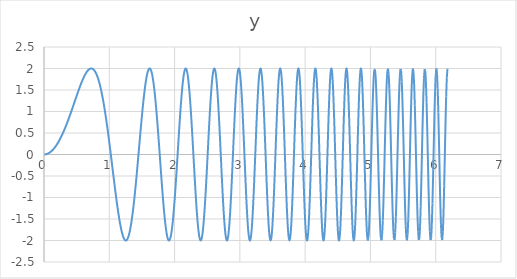
| Category | y |
|---|---|
| 0.0 | 0 |
| 0.01 | 0.001 |
| 0.02 | 0.002 |
| 0.03 | 0.005 |
| 0.04 | 0.01 |
| 0.05 | 0.015 |
| 0.06 | 0.022 |
| 0.07 | 0.029 |
| 0.08 | 0.038 |
| 0.09 | 0.049 |
| 0.1 | 0.06 |
| 0.11 | 0.073 |
| 0.12 | 0.086 |
| 0.13 | 0.101 |
| 0.14 | 0.118 |
| 0.15 | 0.135 |
| 0.16 | 0.153 |
| 0.17 | 0.173 |
| 0.18 | 0.194 |
| 0.19 | 0.216 |
| 0.2 | 0.239 |
| 0.21 | 0.264 |
| 0.22 | 0.289 |
| 0.23 | 0.316 |
| 0.24 | 0.344 |
| 0.25 | 0.373 |
| 0.26 | 0.403 |
| 0.27 | 0.434 |
| 0.28 | 0.466 |
| 0.29 | 0.499 |
| 0.3 | 0.533 |
| 0.31 | 0.569 |
| 0.32 | 0.605 |
| 0.33 | 0.642 |
| 0.34 | 0.68 |
| 0.35000000000000003 | 0.719 |
| 0.36 | 0.758 |
| 0.37 | 0.799 |
| 0.38 | 0.84 |
| 0.39 | 0.881 |
| 0.4 | 0.924 |
| 0.41000000000000003 | 0.966 |
| 0.42 | 1.01 |
| 0.43 | 1.053 |
| 0.44 | 1.097 |
| 0.45 | 1.142 |
| 0.46 | 1.186 |
| 0.47000000000000003 | 1.23 |
| 0.48 | 1.275 |
| 0.49 | 1.319 |
| 0.5 | 1.363 |
| 0.51 | 1.407 |
| 0.52 | 1.45 |
| 0.53 | 1.493 |
| 0.54 | 1.535 |
| 0.55 | 1.576 |
| 0.56 | 1.616 |
| 0.5700000000000001 | 1.655 |
| 0.58 | 1.693 |
| 0.59 | 1.729 |
| 0.6 | 1.764 |
| 0.61 | 1.797 |
| 0.62 | 1.828 |
| 0.63 | 1.857 |
| 0.64 | 1.884 |
| 0.65 | 1.909 |
| 0.66 | 1.931 |
| 0.67 | 1.95 |
| 0.68 | 1.966 |
| 0.6900000000000001 | 1.98 |
| 0.7000000000000001 | 1.99 |
| 0.71 | 1.997 |
| 0.72 | 2 |
| 0.73 | 1.999 |
| 0.74 | 1.995 |
| 0.75 | 1.986 |
| 0.76 | 1.974 |
| 0.77 | 1.957 |
| 0.78 | 1.936 |
| 0.79 | 1.91 |
| 0.8 | 1.879 |
| 0.81 | 1.844 |
| 0.8200000000000001 | 1.804 |
| 0.8300000000000001 | 1.759 |
| 0.84 | 1.709 |
| 0.85 | 1.654 |
| 0.86 | 1.595 |
| 0.87 | 1.53 |
| 0.88 | 1.46 |
| 0.89 | 1.385 |
| 0.9 | 1.306 |
| 0.91 | 1.222 |
| 0.92 | 1.133 |
| 0.93 | 1.04 |
| 0.9400000000000001 | 0.943 |
| 0.9500000000000001 | 0.841 |
| 0.96 | 0.736 |
| 0.97 | 0.627 |
| 0.98 | 0.515 |
| 0.99 | 0.4 |
| 1.0 | 0.282 |
| 1.01 | 0.162 |
| 1.02 | 0.041 |
| 1.03 | -0.082 |
| 1.04 | -0.206 |
| 1.05 | -0.33 |
| 1.06 | -0.454 |
| 1.07 | -0.578 |
| 1.08 | -0.7 |
| 1.09 | -0.82 |
| 1.1 | -0.938 |
| 1.11 | -1.053 |
| 1.12 | -1.165 |
| 1.1300000000000001 | -1.272 |
| 1.1400000000000001 | -1.374 |
| 1.1500000000000001 | -1.47 |
| 1.16 | -1.561 |
| 1.17 | -1.644 |
| 1.18 | -1.72 |
| 1.19 | -1.788 |
| 1.2 | -1.848 |
| 1.21 | -1.898 |
| 1.22 | -1.939 |
| 1.23 | -1.97 |
| 1.24 | -1.99 |
| 1.25 | -1.999 |
| 1.26 | -1.997 |
| 1.27 | -1.984 |
| 1.28 | -1.959 |
| 1.29 | -1.922 |
| 1.3 | -1.873 |
| 1.31 | -1.813 |
| 1.32 | -1.741 |
| 1.33 | -1.657 |
| 1.34 | -1.562 |
| 1.35 | -1.456 |
| 1.36 | -1.34 |
| 1.37 | -1.214 |
| 1.3800000000000001 | -1.079 |
| 1.3900000000000001 | -0.936 |
| 1.4000000000000001 | -0.785 |
| 1.41 | -0.627 |
| 1.42 | -0.464 |
| 1.43 | -0.296 |
| 1.44 | -0.125 |
| 1.45 | 0.049 |
| 1.46 | 0.223 |
| 1.47 | 0.396 |
| 1.48 | 0.568 |
| 1.49 | 0.736 |
| 1.5 | 0.9 |
| 1.51 | 1.057 |
| 1.52 | 1.207 |
| 1.53 | 1.348 |
| 1.54 | 1.478 |
| 1.55 | 1.596 |
| 1.56 | 1.702 |
| 1.57 | 1.793 |
| 1.58 | 1.868 |
| 1.59 | 1.928 |
| 1.6 | 1.97 |
| 1.61 | 1.994 |
| 1.62 | 2 |
| 1.6300000000000001 | 1.986 |
| 1.6400000000000001 | 1.954 |
| 1.6500000000000001 | 1.903 |
| 1.6600000000000001 | 1.832 |
| 1.67 | 1.743 |
| 1.68 | 1.636 |
| 1.69 | 1.511 |
| 1.7 | 1.37 |
| 1.71 | 1.214 |
| 1.72 | 1.045 |
| 1.73 | 0.863 |
| 1.74 | 0.671 |
| 1.75 | 0.47 |
| 1.76 | 0.263 |
| 1.77 | 0.052 |
| 1.78 | -0.161 |
| 1.79 | -0.373 |
| 1.8 | -0.582 |
| 1.81 | -0.785 |
| 1.82 | -0.981 |
| 1.83 | -1.165 |
| 1.84 | -1.337 |
| 1.85 | -1.493 |
| 1.86 | -1.631 |
| 1.87 | -1.75 |
| 1.8800000000000001 | -1.848 |
| 1.8900000000000001 | -1.923 |
| 1.9000000000000001 | -1.973 |
| 1.9100000000000001 | -1.997 |
| 1.92 | -1.996 |
| 1.93 | -1.968 |
| 1.94 | -1.913 |
| 1.95 | -1.833 |
| 1.96 | -1.726 |
| 1.97 | -1.596 |
| 1.98 | -1.442 |
| 1.99 | -1.267 |
| 2.0 | -1.073 |
| 2.0100000000000002 | -0.863 |
| 2.02 | -0.639 |
| 2.0300000000000002 | -0.405 |
| 2.04 | -0.163 |
| 2.05 | 0.082 |
| 2.06 | 0.327 |
| 2.07 | 0.569 |
| 2.08 | 0.802 |
| 2.09 | 1.025 |
| 2.1 | 1.232 |
| 2.11 | 1.421 |
| 2.12 | 1.587 |
| 2.13 | 1.729 |
| 2.14 | 1.843 |
| 2.15 | 1.928 |
| 2.16 | 1.98 |
| 2.17 | 2 |
| 2.18 | 1.986 |
| 2.19 | 1.937 |
| 2.2 | 1.855 |
| 2.21 | 1.74 |
| 2.22 | 1.595 |
| 2.23 | 1.42 |
| 2.24 | 1.219 |
| 2.25 | 0.995 |
| 2.2600000000000002 | 0.751 |
| 2.27 | 0.493 |
| 2.2800000000000002 | 0.225 |
| 2.29 | -0.049 |
| 2.3000000000000003 | -0.323 |
| 2.31 | -0.592 |
| 2.32 | -0.85 |
| 2.33 | -1.094 |
| 2.34 | -1.317 |
| 2.35 | -1.515 |
| 2.36 | -1.684 |
| 2.37 | -1.82 |
| 2.38 | -1.919 |
| 2.39 | -1.98 |
| 2.4 | -2 |
| 2.41 | -1.979 |
| 2.42 | -1.916 |
| 2.43 | -1.813 |
| 2.44 | -1.671 |
| 2.45 | -1.492 |
| 2.46 | -1.28 |
| 2.47 | -1.04 |
| 2.48 | -0.776 |
| 2.49 | -0.493 |
| 2.5 | -0.199 |
| 2.5100000000000002 | 0.101 |
| 2.52 | 0.401 |
| 2.5300000000000002 | 0.692 |
| 2.54 | 0.968 |
| 2.5500000000000003 | 1.223 |
| 2.56 | 1.45 |
| 2.57 | 1.644 |
| 2.58 | 1.8 |
| 2.59 | 1.913 |
| 2.6 | 1.98 |
| 2.61 | 2 |
| 2.62 | 1.97 |
| 2.63 | 1.892 |
| 2.64 | 1.766 |
| 2.65 | 1.596 |
| 2.66 | 1.384 |
| 2.67 | 1.137 |
| 2.68 | 0.859 |
| 2.69 | 0.558 |
| 2.7 | 0.242 |
| 2.71 | -0.082 |
| 2.72 | -0.405 |
| 2.73 | -0.719 |
| 2.74 | -1.014 |
| 2.75 | -1.283 |
| 2.7600000000000002 | -1.518 |
| 2.77 | -1.712 |
| 2.7800000000000002 | -1.86 |
| 2.79 | -1.956 |
| 2.8000000000000003 | -1.998 |
| 2.81 | -1.984 |
| 2.82 | -1.913 |
| 2.83 | -1.788 |
| 2.84 | -1.61 |
| 2.85 | -1.385 |
| 2.86 | -1.119 |
| 2.87 | -0.819 |
| 2.88 | -0.494 |
| 2.89 | -0.153 |
| 2.9 | 0.194 |
| 2.91 | 0.536 |
| 2.92 | 0.864 |
| 2.93 | 1.165 |
| 2.94 | 1.432 |
| 2.95 | 1.655 |
| 2.96 | 1.827 |
| 2.97 | 1.942 |
| 2.98 | 1.996 |
| 2.99 | 1.986 |
| 3.0 | 1.913 |
| 3.0100000000000002 | 1.777 |
| 3.02 | 1.583 |
| 3.0300000000000002 | 1.336 |
| 3.04 | 1.045 |
| 3.0500000000000003 | 0.717 |
| 3.06 | 0.365 |
| 3.0700000000000003 | -0.001 |
| 3.08 | -0.368 |
| 3.09 | -0.723 |
| 3.1 | -1.055 |
| 3.11 | -1.351 |
| 3.12 | -1.602 |
| 3.13 | -1.797 |
| 3.14 | -1.929 |
| 3.15 | -1.994 |
| 3.16 | -1.988 |
| 3.17 | -1.91 |
| 3.18 | -1.763 |
| 3.19 | -1.551 |
| 3.2 | -1.282 |
| 3.21 | -0.965 |
| 3.22 | -0.612 |
| 3.23 | -0.234 |
| 3.24 | 0.154 |
| 3.25 | 0.536 |
| 3.2600000000000002 | 0.9 |
| 3.27 | 1.231 |
| 3.2800000000000002 | 1.515 |
| 3.29 | 1.741 |
| 3.3000000000000003 | 1.901 |
| 3.31 | 1.986 |
| 3.3200000000000003 | 1.994 |
| 3.33 | 1.922 |
| 3.34 | 1.774 |
| 3.35 | 1.554 |
| 3.36 | 1.271 |
| 3.37 | 0.936 |
| 3.38 | 0.561 |
| 3.39 | 0.162 |
| 3.4 | -0.244 |
| 3.41 | -0.642 |
| 3.42 | -1.014 |
| 3.43 | -1.344 |
| 3.44 | -1.619 |
| 3.45 | -1.826 |
| 3.46 | -1.955 |
| 3.47 | -2 |
| 3.48 | -1.959 |
| 3.49 | -1.833 |
| 3.5 | -1.626 |
| 3.5100000000000002 | -1.347 |
| 3.52 | -1.007 |
| 3.5300000000000002 | -0.622 |
| 3.54 | -0.208 |
| 3.5500000000000003 | 0.216 |
| 3.56 | 0.632 |
| 3.5700000000000003 | 1.021 |
| 3.58 | 1.363 |
| 3.59 | 1.644 |
| 3.6 | 1.85 |
| 3.61 | 1.97 |
| 3.62 | 1.998 |
| 3.63 | 1.932 |
| 3.64 | 1.775 |
| 3.65 | 1.533 |
| 3.66 | 1.217 |
| 3.67 | 0.841 |
| 3.68 | 0.424 |
| 3.69 | -0.015 |
| 3.7 | -0.455 |
| 3.71 | -0.873 |
| 3.72 | -1.249 |
| 3.73 | -1.564 |
| 3.74 | -1.802 |
| 3.75 | -1.95 |
| 3.7600000000000002 | -2 |
| 3.77 | -1.949 |
| 3.7800000000000002 | -1.798 |
| 3.79 | -1.554 |
| 3.8000000000000003 | -1.23 |
| 3.81 | -0.841 |
| 3.8200000000000003 | -0.407 |
| 3.83 | 0.049 |
| 3.84 | 0.504 |
| 3.85 | 0.933 |
| 3.86 | 1.314 |
| 3.87 | 1.625 |
| 3.88 | 1.85 |
| 3.89 | 1.975 |
| 3.9 | 1.994 |
| 3.91 | 1.904 |
| 3.92 | 1.709 |
| 3.93 | 1.42 |
| 3.94 | 1.051 |
| 3.95 | 0.622 |
| 3.96 | 0.158 |
| 3.97 | -0.316 |
| 3.98 | -0.774 |
| 3.99 | -1.189 |
| 4.0 | -1.537 |
| 4.01 | -1.797 |
| 4.0200000000000005 | -1.955 |
| 4.03 | -1.999 |
| 4.04 | -1.927 |
| 4.05 | -1.743 |
| 4.0600000000000005 | -1.455 |
| 4.07 | -1.081 |
| 4.08 | -0.641 |
| 4.09 | -0.162 |
| 4.1 | 0.328 |
| 4.11 | 0.799 |
| 4.12 | 1.223 |
| 4.13 | 1.573 |
| 4.14 | 1.828 |
| 4.15 | 1.972 |
| 4.16 | 1.994 |
| 4.17 | 1.892 |
| 4.18 | 1.672 |
| 4.19 | 1.347 |
| 4.2 | 0.936 |
| 4.21 | 0.465 |
| 4.22 | -0.036 |
| 4.23 | -0.537 |
| 4.24 | -1.004 |
| 4.25 | -1.407 |
| 4.26 | -1.72 |
| 4.2700000000000005 | -1.923 |
| 4.28 | -1.999 |
| 4.29 | -1.945 |
| 4.3 | -1.763 |
| 4.3100000000000005 | -1.463 |
| 4.32 | -1.065 |
| 4.33 | -0.595 |
| 4.34 | -0.084 |
| 4.3500000000000005 | 0.434 |
| 4.36 | 0.924 |
| 4.37 | 1.352 |
| 4.38 | 1.688 |
| 4.39 | 1.909 |
| 4.4 | 1.998 |
| 4.41 | 1.95 |
| 4.42 | 1.765 |
| 4.43 | 1.456 |
| 4.44 | 1.044 |
| 4.45 | 0.558 |
| 4.46 | 0.031 |
| 4.47 | -0.5 |
| 4.48 | -0.995 |
| 4.49 | -1.421 |
| 4.5 | -1.744 |
| 4.51 | -1.942 |
| 4.5200000000000005 | -1.999 |
| 4.53 | -1.91 |
| 4.54 | -1.68 |
| 4.55 | -1.325 |
| 4.5600000000000005 | -0.872 |
| 4.57 | -0.352 |
| 4.58 | 0.194 |
| 4.59 | 0.728 |
| 4.6000000000000005 | 1.207 |
| 4.61 | 1.597 |
| 4.62 | 1.865 |
| 4.63 | 1.992 |
| 4.64 | 1.965 |
| 4.65 | 1.788 |
| 4.66 | 1.471 |
| 4.67 | 1.04 |
| 4.68 | 0.526 |
| 4.69 | -0.03 |
| 4.7 | -0.584 |
| 4.71 | -1.094 |
| 4.72 | -1.518 |
| 4.73 | -1.822 |
| 4.74 | -1.98 |
| 4.75 | -1.98 |
| 4.76 | -1.819 |
| 4.7700000000000005 | -1.511 |
| 4.78 | -1.079 |
| 4.79 | -0.558 |
| 4.8 | 0.01 |
| 4.8100000000000005 | 0.578 |
| 4.82 | 1.1 |
| 4.83 | 1.531 |
| 4.84 | 1.835 |
| 4.8500000000000005 | 1.986 |
| 4.86 | 1.97 |
| 4.87 | 1.788 |
| 4.88 | 1.453 |
| 4.89 | 0.994 |
| 4.9 | 0.449 |
| 4.91 | -0.135 |
| 4.92 | -0.709 |
| 4.93 | -1.223 |
| 4.94 | -1.632 |
| 4.95 | -1.899 |
| 4.96 | -1.999 |
| 4.97 | -1.925 |
| 4.98 | -1.68 |
| 4.99 | -1.285 |
| 5.0 | -0.776 |
| 5.01 | -0.196 |
| 5.0200000000000005 | 0.403 |
| 5.03 | 0.967 |
| 5.04 | 1.444 |
| 5.05 | 1.791 |
| 5.0600000000000005 | 1.975 |
| 5.07 | 1.979 |
| 5.08 | 1.801 |
| 5.09 | 1.456 |
| 5.1000000000000005 | 0.976 |
| 5.11 | 0.404 |
| 5.12 | -0.206 |
| 5.13 | -0.799 |
| 5.14 | -1.317 |
| 5.15 | -1.712 |
| 5.16 | -1.946 |
| 5.17 | -1.994 |
| 5.18 | -1.852 |
| 5.19 | -1.533 |
| 5.2 | -1.065 |
| 5.21 | -0.493 |
| 5.22 | 0.127 |
| 5.23 | 0.737 |
| 5.24 | 1.275 |
| 5.25 | 1.689 |
| 5.26 | 1.938 |
| 5.2700000000000005 | 1.996 |
| 5.28 | 1.855 |
| 5.29 | 1.53 |
| 5.3 | 1.05 |
| 5.3100000000000005 | 0.465 |
| 5.32 | -0.168 |
| 5.33 | -0.786 |
| 5.34 | -1.324 |
| 5.3500000000000005 | -1.729 |
| 5.36 | -1.958 |
| 5.37 | -1.986 |
| 5.38 | -1.81 |
| 5.39 | -1.446 |
| 5.4 | -0.932 |
| 5.41 | -0.319 |
| 5.42 | 0.328 |
| 5.43 | 0.941 |
| 5.44 | 1.457 |
| 5.45 | 1.82 |
| 5.46 | 1.99 |
| 5.47 | 1.949 |
| 5.48 | 1.699 |
| 5.49 | 1.267 |
| 5.5 | 0.697 |
| 5.51 | 0.052 |
| 5.5200000000000005 | -0.601 |
| 5.53 | -1.189 |
| 5.54 | -1.648 |
| 5.55 | -1.928 |
| 5.5600000000000005 | -1.996 |
| 5.57 | -1.844 |
| 5.58 | -1.487 |
| 5.59 | -0.965 |
| 5.6000000000000005 | -0.334 |
| 5.61 | 0.335 |
| 5.62 | 0.968 |
| 5.63 | 1.493 |
| 5.64 | 1.85 |
| 5.65 | 1.997 |
| 5.66 | 1.918 |
| 5.67 | 1.618 |
| 5.68 | 1.133 |
| 5.69 | 0.516 |
| 5.7 | -0.161 |
| 5.71 | -0.821 |
| 5.72 | -1.386 |
| 5.73 | -1.791 |
| 5.74 | -1.986 |
| 5.75 | -1.949 |
| 5.76 | -1.681 |
| 5.7700000000000005 | -1.214 |
| 5.78 | -0.602 |
| 5.79 | 0.083 |
| 5.8 | 0.759 |
| 5.8100000000000005 | 1.345 |
| 5.82 | 1.77 |
| 5.83 | 1.982 |
| 5.84 | 1.954 |
| 5.8500000000000005 | 1.688 |
| 5.86 | 1.216 |
| 5.87 | 0.595 |
| 5.88 | -0.101 |
| 5.89 | -0.786 |
| 5.9 | -1.374 |
| 5.91 | -1.793 |
| 5.92 | -1.989 |
| 5.93 | -1.937 |
| 5.94 | -1.642 |
| 5.95 | -1.14 |
| 5.96 | -0.494 |
| 5.97 | 0.217 |
| 5.98 | 0.901 |
| 5.99 | 1.471 |
| 6.0 | 1.854 |
| 6.01 | 1.999 |
| 6.0200000000000005 | 1.888 |
| 6.03 | 1.533 |
| 6.04 | 0.978 |
| 6.05 | 0.295 |
| 6.0600000000000005 | -0.427 |
| 6.07 | -1.094 |
| 6.08 | -1.619 |
| 6.09 | -1.932 |
| 6.1000000000000005 | -1.989 |
| 6.11 | -1.783 |
| 6.12 | -1.34 |
| 6.13 | -0.717 |
| 6.140000000000001 | 0.003 |
| 6.15 | 0.724 |
| 6.16 | 1.348 |
| 6.17 | 1.791 |
| 6.18 | 1.992 |